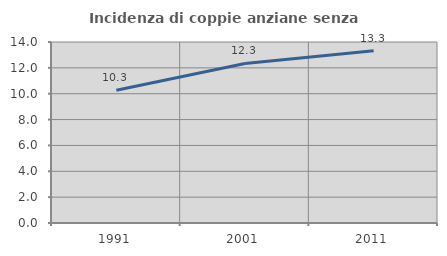
| Category | Incidenza di coppie anziane senza figli  |
|---|---|
| 1991.0 | 10.273 |
| 2001.0 | 12.34 |
| 2011.0 | 13.328 |